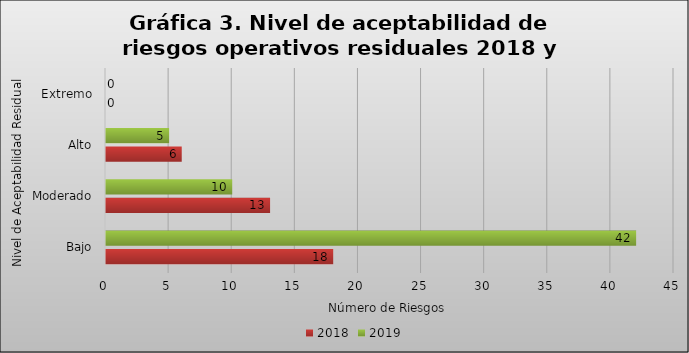
| Category | 2018 | 2019 |
|---|---|---|
| Bajo | 18 | 42 |
| Moderado | 13 | 10 |
| Alto | 6 | 5 |
| Extremo | 0 | 0 |